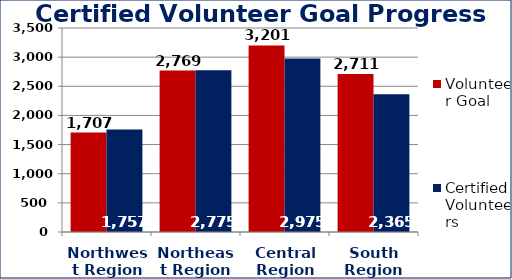
| Category | Volunteer Goal  | Certified Volunteers  |
|---|---|---|
| Northwest Region | 1707 | 1757 |
| Northeast Region | 2769 | 2775 |
| Central Region | 3201 | 2975 |
| South Region | 2711 | 2365 |